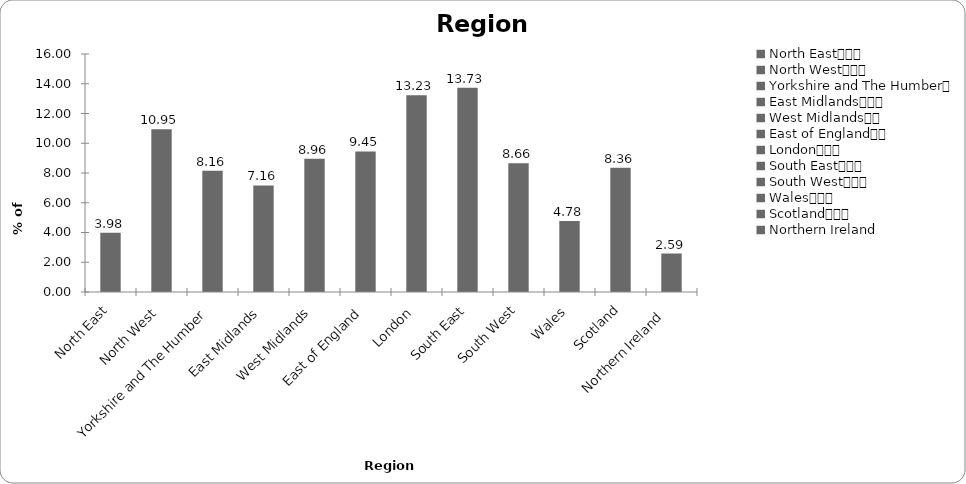
| Category | Region |
|---|---|
| North East			 | 3.98 |
| North West			 | 10.945 |
| Yorkshire and The Humber	 | 8.159 |
| East Midlands			 | 7.164 |
| West Midlands		 | 8.955 |
| East of England		 | 9.453 |
| London			 | 13.234 |
| South East			 | 13.731 |
| South West			 | 8.657 |
| Wales			 | 4.776 |
| Scotland			 | 8.358 |
| Northern Ireland  | 2.587 |